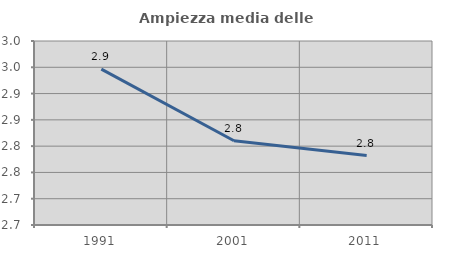
| Category | Ampiezza media delle famiglie |
|---|---|
| 1991.0 | 2.946 |
| 2001.0 | 2.81 |
| 2011.0 | 2.782 |